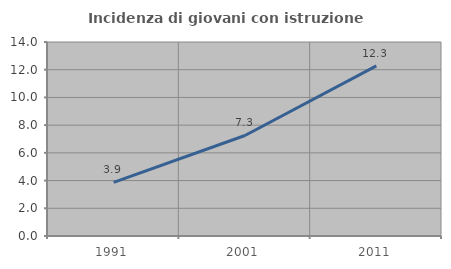
| Category | Incidenza di giovani con istruzione universitaria |
|---|---|
| 1991.0 | 3.87 |
| 2001.0 | 7.253 |
| 2011.0 | 12.281 |